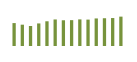
| Category | Saldo [ (1)-(2) ] |
|---|---|
| 0 | 532729.955 |
| 1 | 495602.949 |
| 2 | 464912.543 |
| 3 | 524886.84 |
| 4 | 575003.691 |
| 5 | 617133.535 |
| 6 | 598394.561 |
| 7 | 601130.812 |
| 8 | 618778.996 |
| 9 | 613783.089 |
| 10 | 640835.074 |
| 11 | 645614.486 |
| 12 | 650194 |
| 13 | 683108.098 |